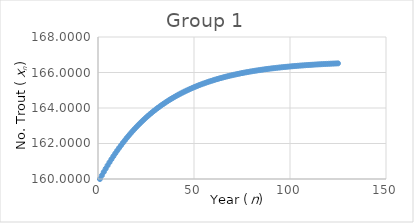
| Category | xn |
|---|---|
| 1.0 | 160 |
| 2.0 | 160.2 |
| 3.0 | 160.394 |
| 4.0 | 160.582 |
| 5.0 | 160.765 |
| 6.0 | 160.942 |
| 7.0 | 161.114 |
| 8.0 | 161.28 |
| 9.0 | 161.442 |
| 10.0 | 161.598 |
| 11.0 | 161.751 |
| 12.0 | 161.898 |
| 13.0 | 162.041 |
| 14.0 | 162.18 |
| 15.0 | 162.314 |
| 16.0 | 162.445 |
| 17.0 | 162.572 |
| 18.0 | 162.694 |
| 19.0 | 162.814 |
| 20.0 | 162.929 |
| 21.0 | 163.041 |
| 22.0 | 163.15 |
| 23.0 | 163.256 |
| 24.0 | 163.358 |
| 25.0 | 163.457 |
| 26.0 | 163.554 |
| 27.0 | 163.647 |
| 28.0 | 163.737 |
| 29.0 | 163.825 |
| 30.0 | 163.911 |
| 31.0 | 163.993 |
| 32.0 | 164.073 |
| 33.0 | 164.151 |
| 34.0 | 164.227 |
| 35.0 | 164.3 |
| 36.0 | 164.371 |
| 37.0 | 164.44 |
| 38.0 | 164.507 |
| 39.0 | 164.571 |
| 40.0 | 164.634 |
| 41.0 | 164.695 |
| 42.0 | 164.754 |
| 43.0 | 164.812 |
| 44.0 | 164.867 |
| 45.0 | 164.921 |
| 46.0 | 164.974 |
| 47.0 | 165.025 |
| 48.0 | 165.074 |
| 49.0 | 165.122 |
| 50.0 | 165.168 |
| 51.0 | 165.213 |
| 52.0 | 165.257 |
| 53.0 | 165.299 |
| 54.0 | 165.34 |
| 55.0 | 165.38 |
| 56.0 | 165.418 |
| 57.0 | 165.456 |
| 58.0 | 165.492 |
| 59.0 | 165.527 |
| 60.0 | 165.561 |
| 61.0 | 165.595 |
| 62.0 | 165.627 |
| 63.0 | 165.658 |
| 64.0 | 165.688 |
| 65.0 | 165.718 |
| 66.0 | 165.746 |
| 67.0 | 165.774 |
| 68.0 | 165.8 |
| 69.0 | 165.826 |
| 70.0 | 165.852 |
| 71.0 | 165.876 |
| 72.0 | 165.9 |
| 73.0 | 165.923 |
| 74.0 | 165.945 |
| 75.0 | 165.967 |
| 76.0 | 165.988 |
| 77.0 | 166.008 |
| 78.0 | 166.028 |
| 79.0 | 166.047 |
| 80.0 | 166.066 |
| 81.0 | 166.084 |
| 82.0 | 166.101 |
| 83.0 | 166.118 |
| 84.0 | 166.135 |
| 85.0 | 166.151 |
| 86.0 | 166.166 |
| 87.0 | 166.181 |
| 88.0 | 166.196 |
| 89.0 | 166.21 |
| 90.0 | 166.223 |
| 91.0 | 166.237 |
| 92.0 | 166.25 |
| 93.0 | 166.262 |
| 94.0 | 166.274 |
| 95.0 | 166.286 |
| 96.0 | 166.297 |
| 97.0 | 166.309 |
| 98.0 | 166.319 |
| 99.0 | 166.33 |
| 100.0 | 166.34 |
| 101.0 | 166.35 |
| 102.0 | 166.359 |
| 103.0 | 166.368 |
| 104.0 | 166.377 |
| 105.0 | 166.386 |
| 106.0 | 166.394 |
| 107.0 | 166.403 |
| 108.0 | 166.411 |
| 109.0 | 166.418 |
| 110.0 | 166.426 |
| 111.0 | 166.433 |
| 112.0 | 166.44 |
| 113.0 | 166.447 |
| 114.0 | 166.453 |
| 115.0 | 166.46 |
| 116.0 | 166.466 |
| 117.0 | 166.472 |
| 118.0 | 166.478 |
| 119.0 | 166.483 |
| 120.0 | 166.489 |
| 121.0 | 166.494 |
| 122.0 | 166.499 |
| 123.0 | 166.504 |
| 124.0 | 166.509 |
| 125.0 | 166.514 |